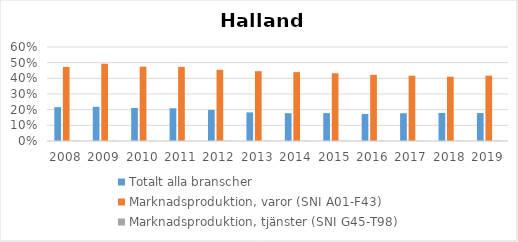
| Category | Totalt alla branscher | Marknadsproduktion, varor (SNI A01-F43) | Marknadsproduktion, tjänster (SNI G45-T98) |
|---|---|---|---|
| 2008 | 0.216 | 0.473 | 0.002 |
| 2009 | 0.218 | 0.493 | 0.002 |
| 2010 | 0.211 | 0.474 | 0.002 |
| 2011 | 0.209 | 0.473 | 0.002 |
| 2012 | 0.198 | 0.454 | 0.002 |
| 2013 | 0.183 | 0.446 | 0.002 |
| 2014 | 0.177 | 0.44 | 0.002 |
| 2015 | 0.178 | 0.432 | 0.002 |
| 2016 | 0.172 | 0.422 | 0.002 |
| 2017 | 0.177 | 0.417 | 0.002 |
| 2018 | 0.179 | 0.41 | 0.002 |
| 2019 | 0.178 | 0.417 | 0.002 |